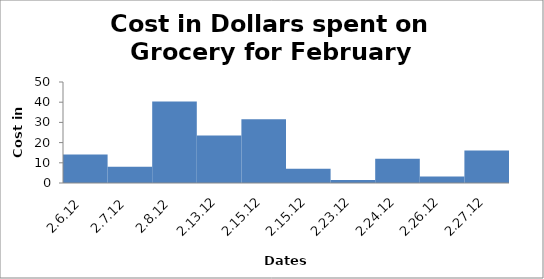
| Category | Cost in Dollars |
|---|---|
| 2.6.12 | 14.06 |
| 2.7.12 | 8.05 |
| 2.8.12 | 40.32 |
| 2.13.12 | 23.49 |
| 2.15.12 | 31.53 |
| 2.15.12 | 7.07 |
| 2.23.12 | 1.49 |
| 2.24.12 | 12 |
| 2.26.12 | 3.18 |
| 2.27.12 | 16.07 |